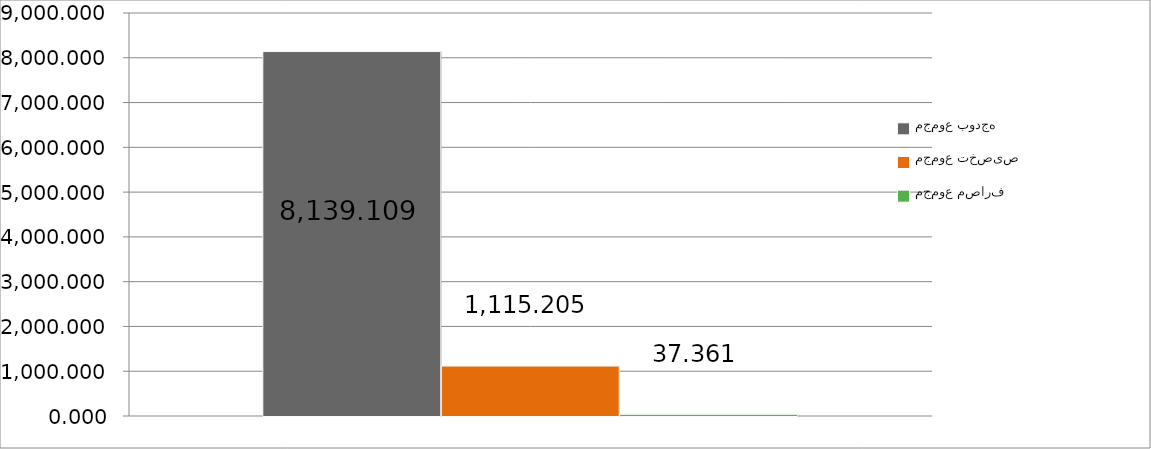
| Category | مجموع بودجه  | مجموع تخصیص | مجموع مصارف |
|---|---|---|---|
| 0 | 8139.109 | 1115.205 | 37.361 |